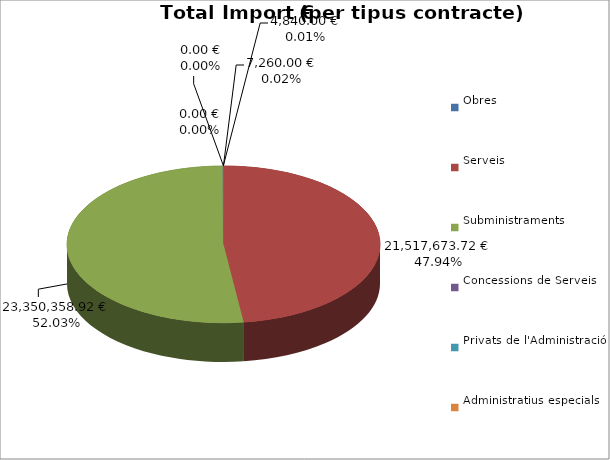
| Category | Total preu
(amb IVA) |
|---|---|
| Obres | 0 |
| Serveis | 21517673.72 |
| Subministraments | 23350358.92 |
| Concessions de Serveis | 0 |
| Privats de l'Administració | 4840 |
| Administratius especials | 7260 |